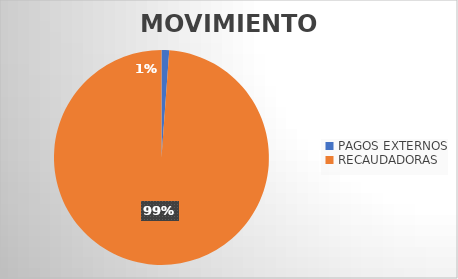
| Category | MOVIMIENTOS |
|---|---|
| PAGOS EXTERNOS | 230 |
| RECAUDADORAS | 19712 |